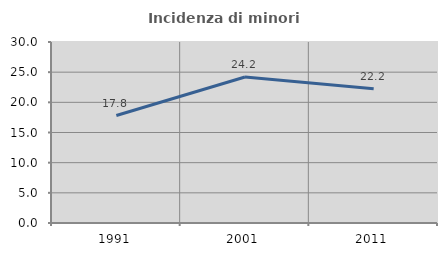
| Category | Incidenza di minori stranieri |
|---|---|
| 1991.0 | 17.808 |
| 2001.0 | 24.201 |
| 2011.0 | 22.248 |